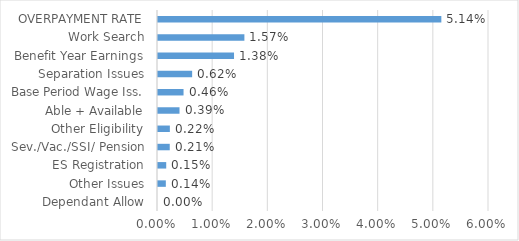
| Category | Series 0 |
|---|---|
| Dependant Allow | 0 |
| Other Issues | 0.001 |
| ES Registration | 0.001 |
| Sev./Vac./SSI/ Pension | 0.002 |
| Other Eligibility | 0.002 |
| Able + Available | 0.004 |
| Base Period Wage Iss. | 0.005 |
| Separation Issues | 0.006 |
| Benefit Year Earnings | 0.014 |
| Work Search | 0.016 |
| OVERPAYMENT RATE | 0.051 |